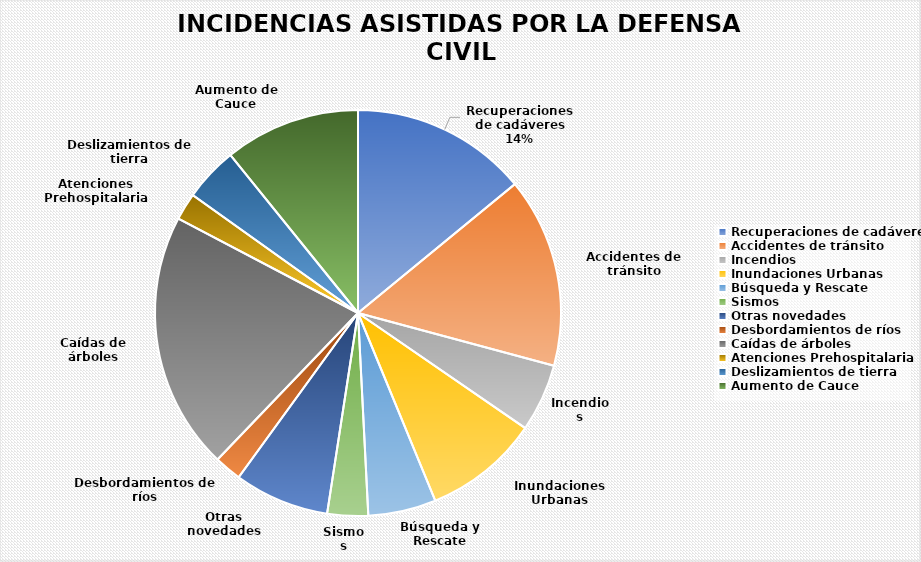
| Category | Series 0 |
|---|---|
| Recuperaciones de cadáveres | 26 |
| Accidentes de tránsito | 28 |
| Incendios | 10 |
| Inundaciones Urbanas | 17 |
| Búsqueda y Rescate | 10 |
| Sismos | 6 |
| Otras novedades | 14 |
| Desbordamientos de ríos | 4 |
| Caídas de árboles | 38 |
| Atenciones Prehospitalaria | 4 |
| Deslizamientos de tierra | 8 |
| Aumento de Cauce | 20 |